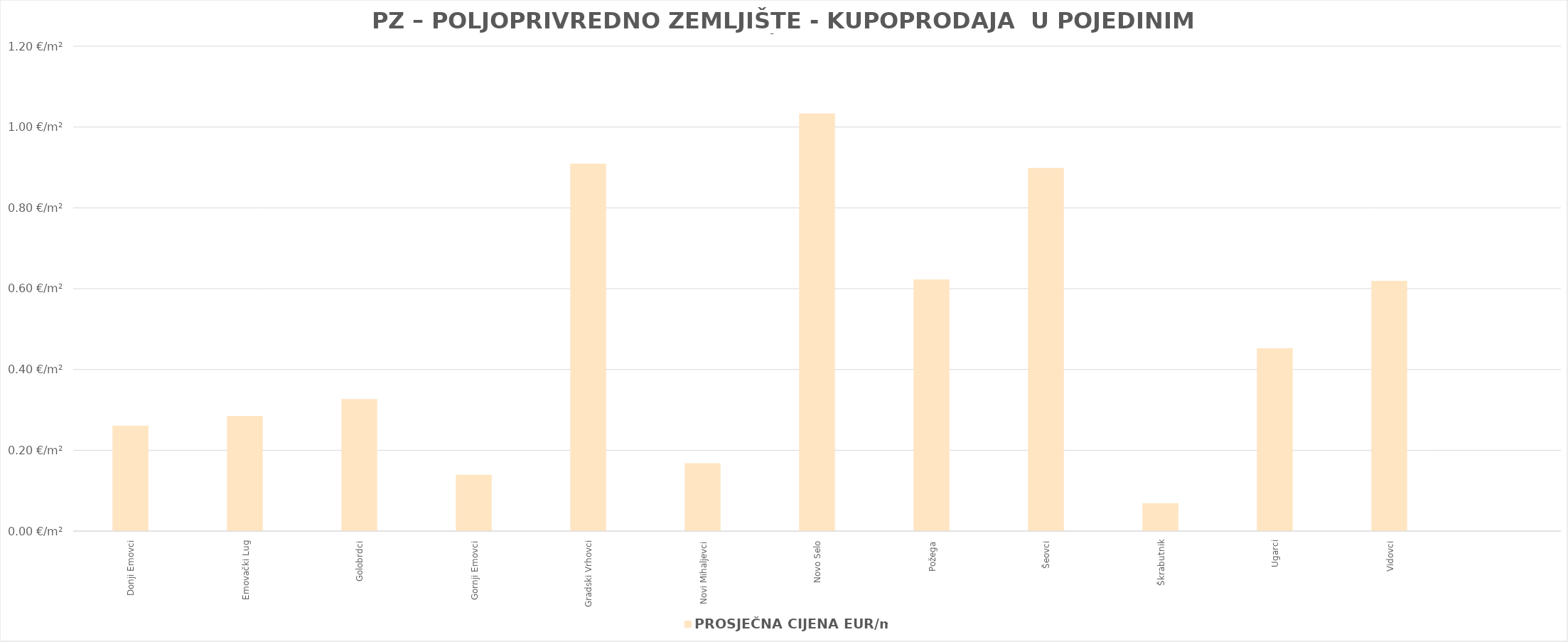
| Category | PROSJEČNA CIJENA EUR/m2 |
|---|---|
| Donji Emovci | 0.261 |
| Emovački Lug | 0.285 |
| Golobrdci | 0.327 |
| Gornji Emovci | 0.139 |
| Gradski Vrhovci | 0.909 |
| Novi Mihaljevci | 0.168 |
| Novo Selo | 1900-01-01 00:48:37 |
| Požega | 0.623 |
| Šeovci | 0.899 |
| Škrabutnik | 0.069 |
| Ugarci | 0.453 |
| Vidovci | 0.619 |